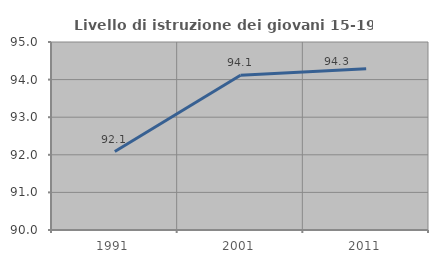
| Category | Livello di istruzione dei giovani 15-19 anni |
|---|---|
| 1991.0 | 92.086 |
| 2001.0 | 94.118 |
| 2011.0 | 94.286 |